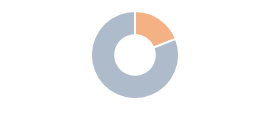
| Category | Series 0 |
|---|---|
| 0 | 0.19 |
| 1 | 0.81 |